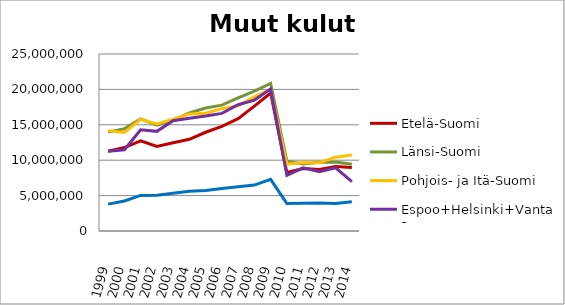
| Category | Etelä-Suomi | Länsi-Suomi | Pohjois- ja Itä-Suomi | Espoo+Helsinki+Vantaa | Muu Uusimaa |
|---|---|---|---|---|---|
| 1999.0 | 11254549.77 | 13963936.11 | 14151753.8 | 11276817.65 | 3798270.17 |
| 2000.0 | 11787547.33 | 14441678.84 | 13907825.34 | 11483871.61 | 4243044.99 |
| 2001.0 | 12736302.24 | 15831894.83 | 15766495.64 | 14303789.78 | 5023343.96 |
| 2002.0 | 11929732 | 14955923 | 15120131 | 14074146 | 5038204 |
| 2003.0 | 12464103 | 15641850 | 15793660 | 15572167 | 5319787 |
| 2004.0 | 12956816 | 16668644 | 16540060 | 15930546 | 5604774 |
| 2005.0 | 13947073 | 17362748 | 16637420 | 16243995 | 5733851 |
| 2006.0 | 14776906 | 17777041 | 17283781 | 16609607 | 6011403 |
| 2007.0 | 15861702 | 18786210 | 17693392 | 17830257 | 6250947 |
| 2008.0 | 17632954.11 | 19749101.36 | 18948958.89 | 18487642 | 6486008 |
| 2009.0 | 19481878.28 | 20849183.18 | 19991997.11 | 20042590.58 | 7288024.97 |
| 2010.0 | 8251953.79 | 9857054.69 | 9442593.89 | 7847940.47 | 3875478 |
| 2011.0 | 8830529.61 | 9474036.96 | 9679512.58 | 8929588.46 | 3923594.39 |
| 2012.0 | 8675414.3 | 9711695.7 | 9647301.83 | 8384530.54 | 3947744.39 |
| 2013.0 | 9107152.9 | 9733359.87 | 10428916.43 | 8927159.16 | 3877050 |
| 2014.0 | 8956142.5 | 9440315.02 | 10729990.9 | 6985936.79 | 4138754.6 |